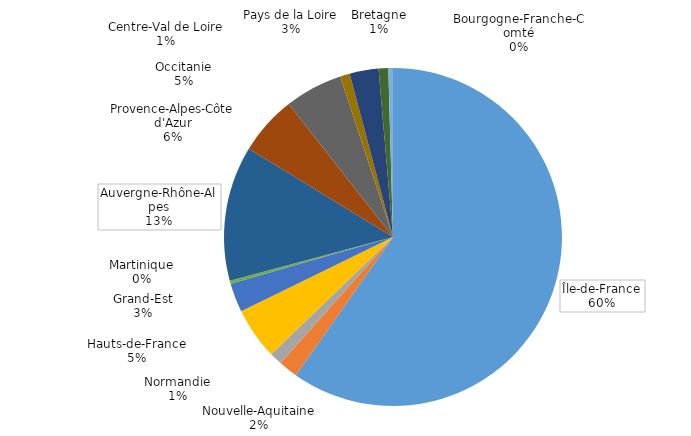
| Category | Series 0 |
|---|---|
| Île-de-France | 0.598 |
| Nouvelle-Aquitaine | 0.018 |
| Normandie | 0.012 |
| Hauts-de-France | 0.05 |
| Grand-Est | 0.028 |
| Martinique | 0.003 |
| Auvergne-Rhône-Alpes | 0.129 |
| Provence-Alpes-Côte d'Azur | 0.057 |
| Occitanie | 0.055 |
| Centre-Val de Loire | 0.009 |
| Pays de la Loire | 0.028 |
| Bretagne | 0.009 |
| Bourgogne-Franche-Comté | 0.004 |